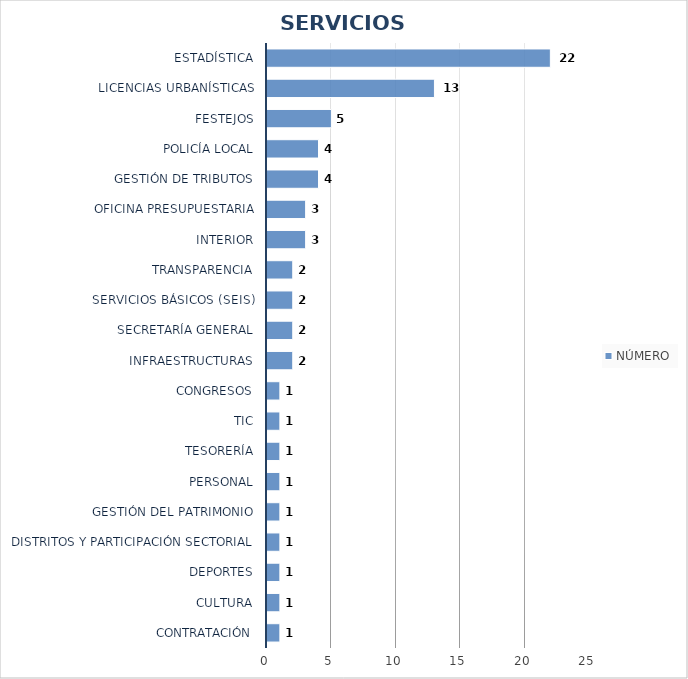
| Category | NÚMERO |
|---|---|
| Contratación | 1 |
| Cultura | 1 |
| Deportes | 1 |
| Distritos y Participación Sectorial | 1 |
| Gestión del Patrimonio | 1 |
| Personal | 1 |
| Tesorería | 1 |
| TIC | 1 |
| Congresos | 1 |
| Infraestructuras | 2 |
| Secretaría General | 2 |
| Servicios Básicos (SEIS) | 2 |
| Transparencia | 2 |
| Interior | 3 |
| Oficina Presupuestaria | 3 |
| Gestión de Tributos | 4 |
| Policía Local | 4 |
| Festejos | 5 |
| Licencias Urbanísticas | 13 |
| Estadística | 22 |